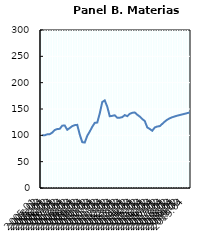
| Category | Materias primas |
|---|---|
| 2005:01 | 100 |
| 2005:02 | 100.169 |
| 2005:03 | 101.896 |
| 2005:04 | 102.191 |
| 2006:01 | 105.183 |
| 2006:02 | 110.029 |
| 2006:03 | 111.968 |
| 2006:04 | 112.347 |
| 2007:01 | 118.373 |
| 2007:02 | 118.668 |
| 2007:03 | 110.535 |
| 2007:04 | 113.906 |
| 2008:01 | 117.488 |
| 2008:02 | 119.385 |
| 2008:03 | 119.89 |
| 2008:04 | 101.475 |
| 2009:01 | 87.021 |
| 2009:02 | 86.304 |
| 2009:03 | 99.157 |
| 2009:04 | 107.206 |
| 2010:01 | 116.182 |
| 2010:02 | 123.683 |
| 2010:03 | 124.231 |
| 2010:04 | 141.593 |
| 2011:01 | 163.211 |
| 2011:02 | 166.33 |
| 2011:03 | 154.488 |
| 2011:04 | 136.241 |
| 2012:01 | 137 |
| 2012:02 | 138.053 |
| 2012:03 | 133.249 |
| 2012:04 | 133.418 |
| 2013:01 | 134.555 |
| 2013:02 | 138.432 |
| 2013:03 | 136.452 |
| 2013:04 | 140.834 |
| 2014:01 | 142.773 |
| 2014:02 | 143.447 |
| 2014:03 | 139.191 |
| 2014:04 | 135.651 |
| 2015:01 | 130.973 |
| 2015:02 | 127.307 |
| 2015:03 | 115.129 |
| 2015:04 | 112.094 |
| 2016:01 | 108.681 |
| 2016:02 | 114.876 |
| 2016:03 | 116.772 |
| 2016:04 | 117.488 |
| 2017:01 | 121.702 |
| 2017:02 | 126.072 |
| 2017:03 | 129.66 |
| 2017:04 | 132.402 |
| 2018:01 | 134.365 |
| 2018:02 | 135.901 |
| 2018:03 | 137.293 |
| 2018:04 | 138.54 |
| 2019:01 | 139.75 |
| 2019:02 | 140.946 |
| 2019:03 | 142.175 |
| 2019:04 | 143.434 |